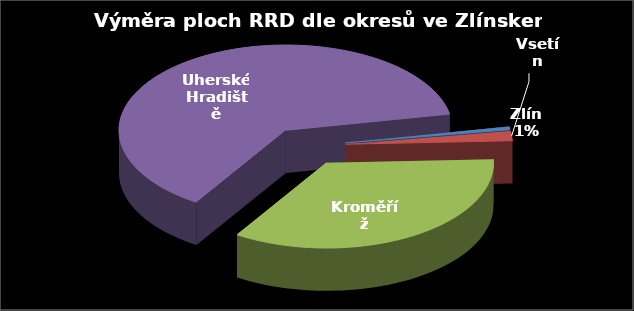
| Category | Výměra [ha] |
|---|---|
| Zlín | 0.44 |
| Vsetín | 1.37 |
| Kroměříž | 26.23 |
| Uherské Hradiště | 47.62 |